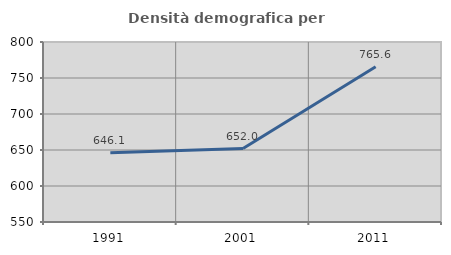
| Category | Densità demografica |
|---|---|
| 1991.0 | 646.133 |
| 2001.0 | 652.002 |
| 2011.0 | 765.638 |